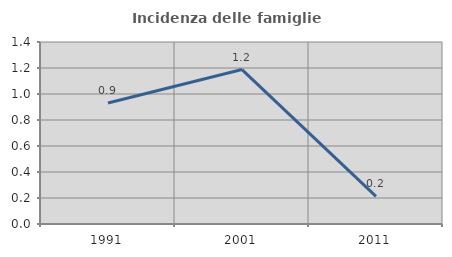
| Category | Incidenza delle famiglie numerose |
|---|---|
| 1991.0 | 0.931 |
| 2001.0 | 1.188 |
| 2011.0 | 0.213 |